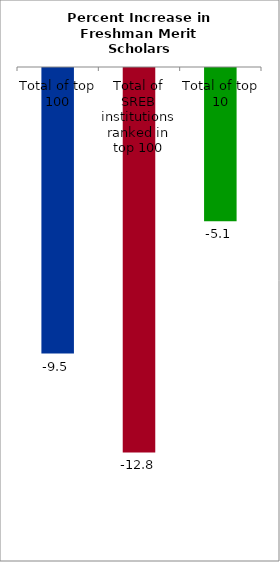
| Category | Series 0 |
|---|---|
| Total of top 100 | -9.498 |
| Total of SREB institutions ranked in top 100 | -12.784 |
| Total of top 10 | -5.099 |